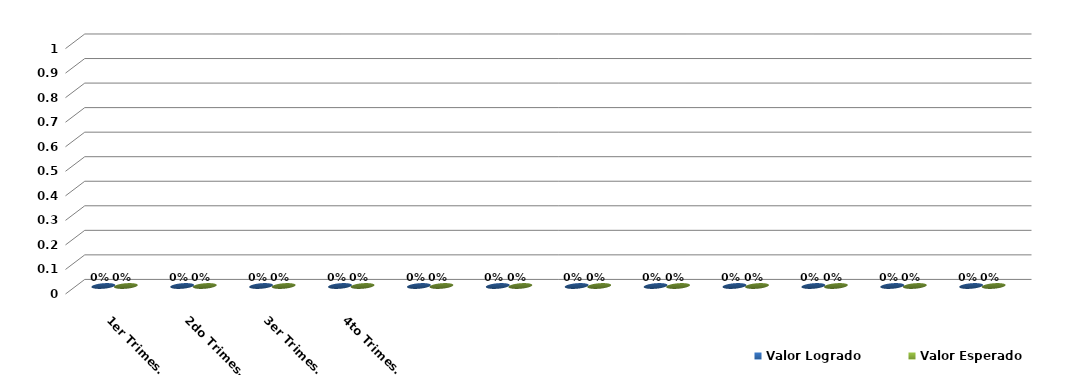
| Category | Valor Logrado | Valor Esperado |
|---|---|---|
| 1er Trimestre | 0 | 0 |
| 2do Trimestre | 0 | 0 |
| 3er Trimestre | 0 | 0 |
| 4to Trimestre | 0 | 0 |